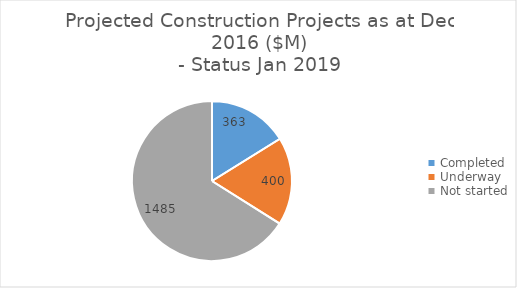
| Category | Series 0 |
|---|---|
| Completed | 363 |
| Underway | 400 |
| Not started | 1485 |